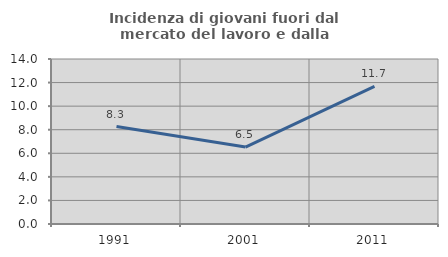
| Category | Incidenza di giovani fuori dal mercato del lavoro e dalla formazione  |
|---|---|
| 1991.0 | 8.264 |
| 2001.0 | 6.529 |
| 2011.0 | 11.673 |